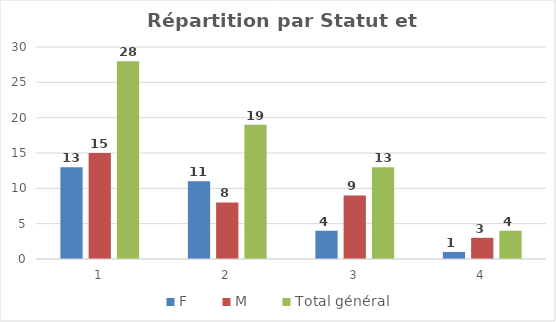
| Category | F | M | Total général |
|---|---|---|---|
| 1.0 | 13 | 15 | 28 |
| 2.0 | 11 | 8 | 19 |
| 3.0 | 4 | 9 | 13 |
| 4.0 | 1 | 3 | 4 |